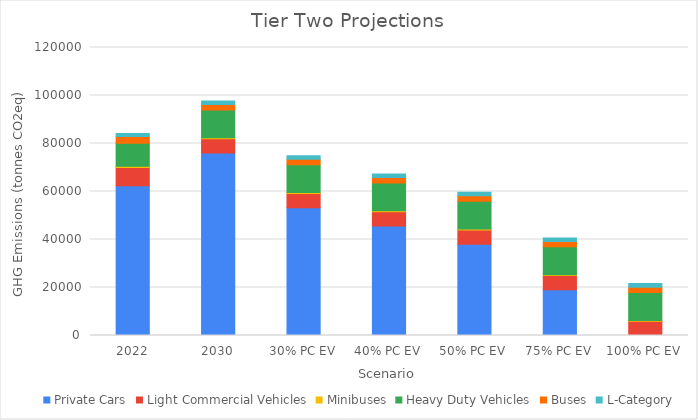
| Category | Private Cars | Light Commercial Vehicles | Minibuses | Heavy Duty Vehicles | Buses | L-Category |
|---|---|---|---|---|---|---|
| 2022 | 62351.7 | 7676.179 | 466.829 | 9647.585 | 2758.861 | 1264.089 |
| 2030 | 76085.492 | 5928.415 | 365.893 | 11628.921 | 2230.695 | 1498.851 |
| 30% PC EV | 53259.845 | 5928.415 | 365.893 | 11628.921 | 2230.695 | 1498.851 |
| 40% PC EV | 45651.295 | 5928.415 | 365.893 | 11628.921 | 2230.695 | 1498.851 |
| 50% PC EV | 38042.746 | 5928.415 | 365.893 | 11628.921 | 2230.695 | 1498.851 |
| 75% PC EV | 19021.373 | 5928.415 | 365.893 | 11628.921 | 2230.695 | 1498.851 |
| 100% PC EV | 0 | 5928.415 | 365.893 | 11628.921 | 2230.695 | 1498.851 |